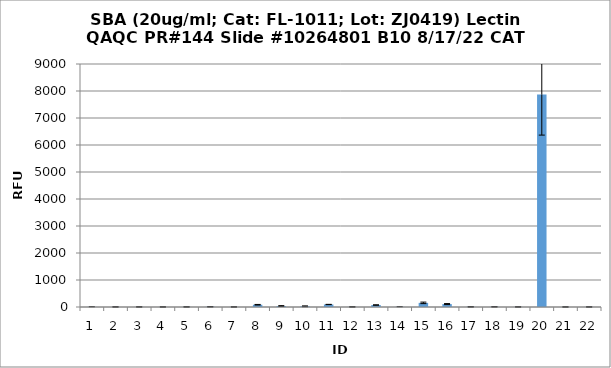
| Category | Series 0 |
|---|---|
| 0 | 3.75 |
| 1 | 3.25 |
| 2 | 3 |
| 3 | 2 |
| 4 | 3.5 |
| 5 | 7.75 |
| 6 | 2.5 |
| 7 | 83.5 |
| 8 | 35.5 |
| 9 | 25.5 |
| 10 | 93.25 |
| 11 | 3.75 |
| 12 | 73 |
| 13 | 5 |
| 14 | 153.25 |
| 15 | 107.75 |
| 16 | 5.75 |
| 17 | 6.5 |
| 18 | 2.75 |
| 19 | 7868.5 |
| 20 | 1.75 |
| 21 | 2.25 |